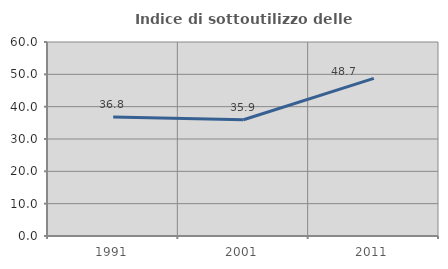
| Category | Indice di sottoutilizzo delle abitazioni  |
|---|---|
| 1991.0 | 36.767 |
| 2001.0 | 35.945 |
| 2011.0 | 48.742 |